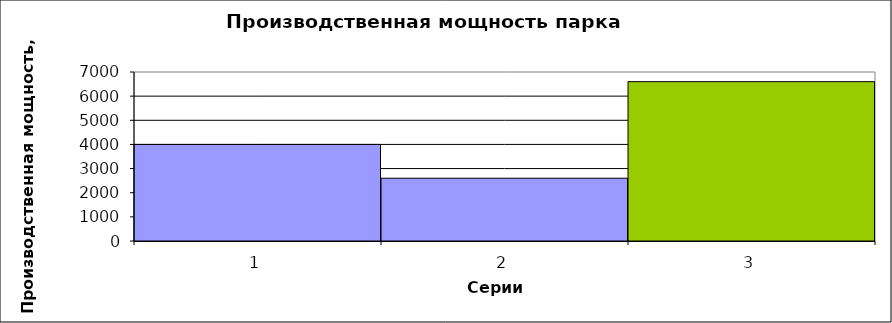
| Category | Series 0 |
|---|---|
| 0 | 4000 |
| 1 | 2600 |
| 2 | 6600 |